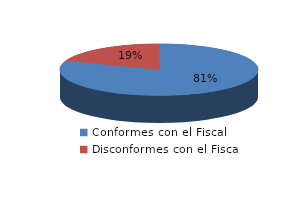
| Category | Series 0 |
|---|---|
| 0 | 4562 |
| 1 | 1100 |